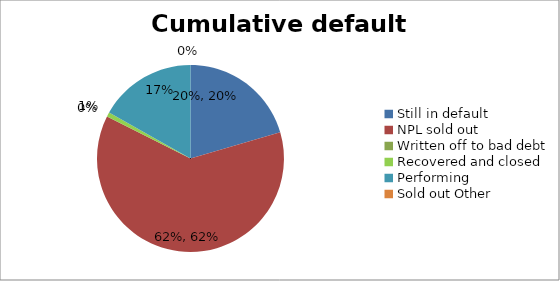
| Category | Series 0 | Series 1 |
|---|---|---|
| Still in default | 0.205 | 0.669 |
| NPL sold out | 0.62 | 0 |
| Written off to bad debt | 0 | 0 |
| Recovered and closed | 0.007 | 0 |
| Performing | 0.168 | 0.331 |
| Sold out Other | 0 | 0 |